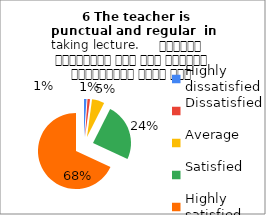
| Category |    6 The teacher is 
punctual and regular  in taking lecture.     शिक्षक समयनिष्ठ हैं एवं नियमित व्याख्यान देते हैं |
|---|---|
| Highly dissatisfied | 1 |
| Dissatisfied | 1 |
| Average | 5 |
| Satisfied | 23 |
| Highly satisfied | 64 |